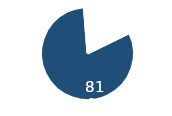
| Category | Chg |
|---|---|
| 0 | 0.81 |
| 1 | 0.19 |